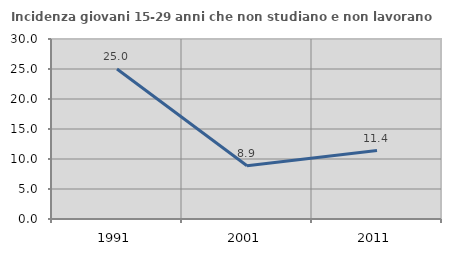
| Category | Incidenza giovani 15-29 anni che non studiano e non lavorano  |
|---|---|
| 1991.0 | 25 |
| 2001.0 | 8.875 |
| 2011.0 | 11.4 |